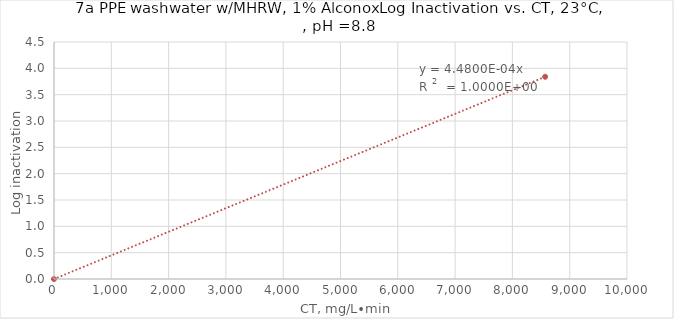
| Category | Series 1 |
|---|---|
| 0.0 | 0 |
| 8571.428571428572 | 3.84 |